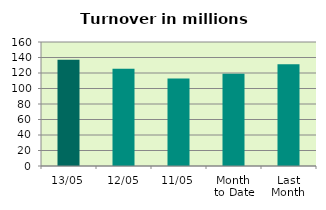
| Category | Series 0 |
|---|---|
| 13/05 | 136.938 |
| 12/05 | 125.568 |
| 11/05 | 112.951 |
| Month 
to Date | 119.023 |
| Last
Month | 131.238 |